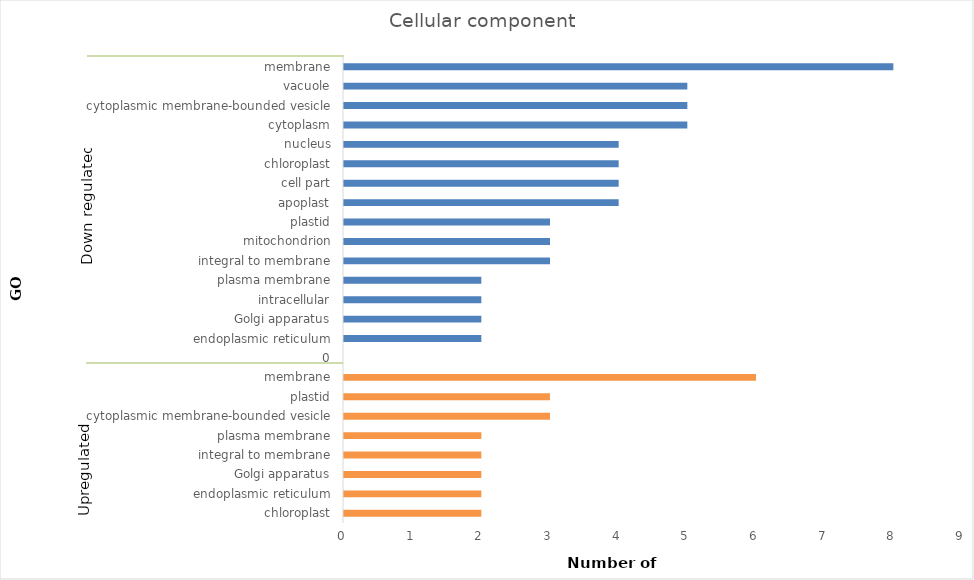
| Category | Cellular_upreg |
|---|---|
| _x000b_chloroplast | 2 |
| _x0015_endoplasmic reticulum | 2 |
| _x000f_Golgi apparatus | 2 |
| _x0014_integral to membrane | 2 |
| _x000f_plasma membrane | 2 |
| $cytoplasmic membrane-bounded vesicle | 3 |
| _x0007_plastid | 3 |
| _x0008_membrane | 6 |
| _x0001_0 | 0 |
| _x0015_endoplasmic reticulum | 2 |
| _x000f_Golgi apparatus | 2 |
| _x000d_intracellular | 2 |
| _x000f_plasma membrane | 2 |
| _x0014_integral to membrane | 3 |
| _x000d_mitochondrion | 3 |
| _x0007_plastid | 3 |
| _x0008_apoplast | 4 |
| 	cell part | 4 |
| _x000b_chloroplast | 4 |
| _x0007_nucleus | 4 |
| 	cytoplasm | 5 |
| $cytoplasmic membrane-bounded vesicle | 5 |
| _x0007_vacuole | 5 |
| _x0008_membrane | 8 |